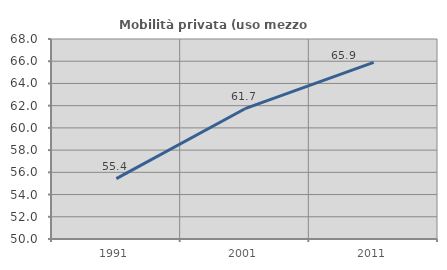
| Category | Mobilità privata (uso mezzo privato) |
|---|---|
| 1991.0 | 55.436 |
| 2001.0 | 61.727 |
| 2011.0 | 65.898 |